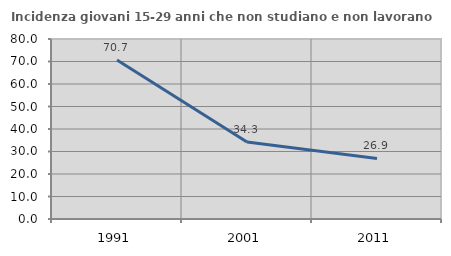
| Category | Incidenza giovani 15-29 anni che non studiano e non lavorano  |
|---|---|
| 1991.0 | 70.651 |
| 2001.0 | 34.262 |
| 2011.0 | 26.92 |